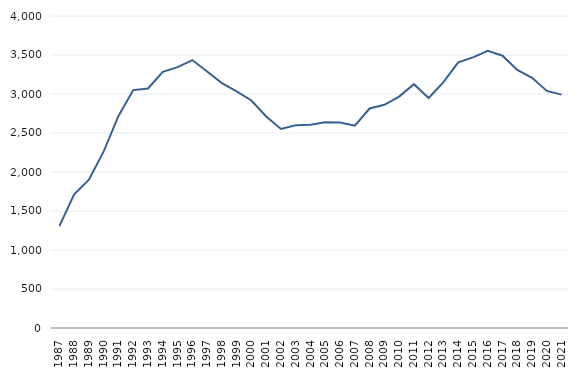
| Category | Series 1 |
|---|---|
| 1987.0 | 1306 |
| 1988.0 | 1715 |
| 1989.0 | 1901 |
| 1990.0 | 2264 |
| 1991.0 | 2719 |
| 1992.0 | 3050 |
| 1993.0 | 3071 |
| 1994.0 | 3285 |
| 1995.0 | 3344 |
| 1996.0 | 3435 |
| 1997.0 | 3288 |
| 1998.0 | 3139 |
| 1999.0 | 3034 |
| 2000.0 | 2917 |
| 2001.0 | 2712 |
| 2002.0 | 2552 |
| 2003.0 | 2598 |
| 2004.0 | 2605 |
| 2005.0 | 2639 |
| 2006.0 | 2634 |
| 2007.0 | 2593 |
| 2008.0 | 2814 |
| 2009.0 | 2861 |
| 2010.0 | 2967 |
| 2011.0 | 3126 |
| 2012.0 | 2949 |
| 2013.0 | 3152 |
| 2014.0 | 3406 |
| 2015.0 | 3470 |
| 2016.0 | 3553 |
| 2017.0 | 3491 |
| 2018.0 | 3309 |
| 2019.0 | 3208 |
| 2020.0 | 3039 |
| 2021.0 | 2992 |